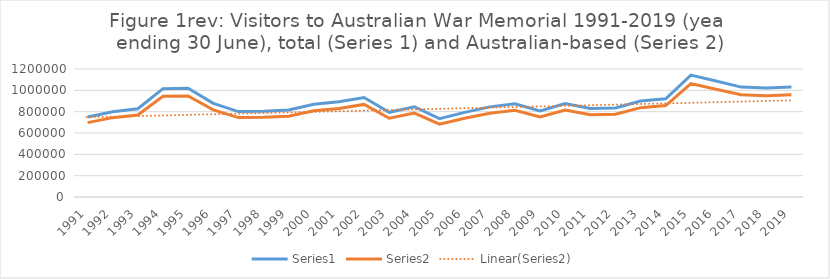
| Category | Series 0 | Series 1 |
|---|---|---|
| 1991.0 | 750000 | 697500 |
| 1992.0 | 800000 | 744000 |
| 1993.0 | 827327 | 769414 |
| 1994.0 | 1015781 | 944676 |
| 1995.0 | 1019279 | 947929 |
| 1996.0 | 877680 | 816242 |
| 1997.0 | 800790 | 744735 |
| 1998.0 | 802950 | 746743 |
| 1999.0 | 814850 | 757810 |
| 2000.0 | 868600 | 807798 |
| 2001.0 | 892017 | 829576 |
| 2002.0 | 933200 | 867876 |
| 2003.0 | 794020 | 738439 |
| 2004.0 | 845995 | 786775 |
| 2005.0 | 733975 | 682597 |
| 2006.0 | 793335 | 737802 |
| 2007.0 | 844899 | 785576 |
| 2008.0 | 873547 | 812399 |
| 2009.0 | 807066 | 750571 |
| 2010.0 | 877000 | 815610 |
| 2011.0 | 830000 | 771900 |
| 2012.0 | 835000 | 776550 |
| 2013.0 | 900500 | 837465 |
| 2014.0 | 921300 | 856809 |
| 2015.0 | 1142814 | 1062817 |
| 2016.0 | 1087000 | 1010910 |
| 2017.0 | 1030104 | 957997 |
| 2018.0 | 1021362 | 949867 |
| 2019.0 | 1031656 | 959440 |